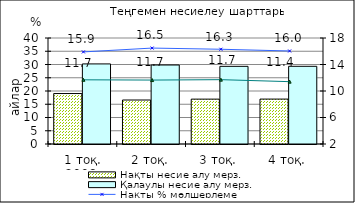
| Category | Нақты несие алу мерз. | Қалаулы несие алу мерз. |
|---|---|---|
| 1 тоқ. 2008  | 19.04 | 30.22 |
| 2 тоқ. | 16.6 | 29.81 |
| 3 тоқ. | 16.93 | 29.31 |
| 4 тоқ. | 16.95 | 29.32 |